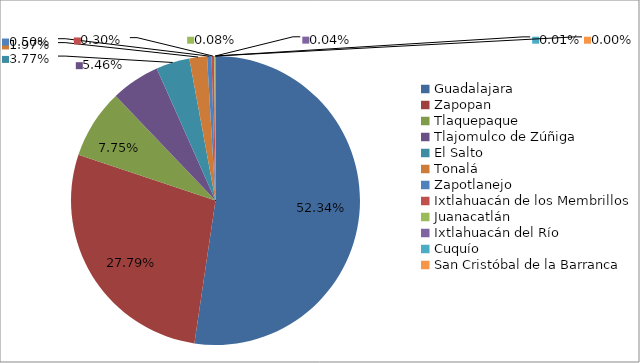
| Category | Series 0 |
|---|---|
| Guadalajara | 681419 |
| Zapopan | 361768 |
| Tlaquepaque | 100839 |
| Tlajomulco de Zúñiga | 71094 |
| El Salto | 49036 |
| Tonalá | 25626 |
| Zapotlanejo | 6460 |
| Ixtlahuacán de los Membrillos | 3954 |
| Juanacatlán | 979 |
| Ixtlahuacán del Río | 587 |
| Cuquío | 171 |
| San Cristóbal de la Barranca | 20 |